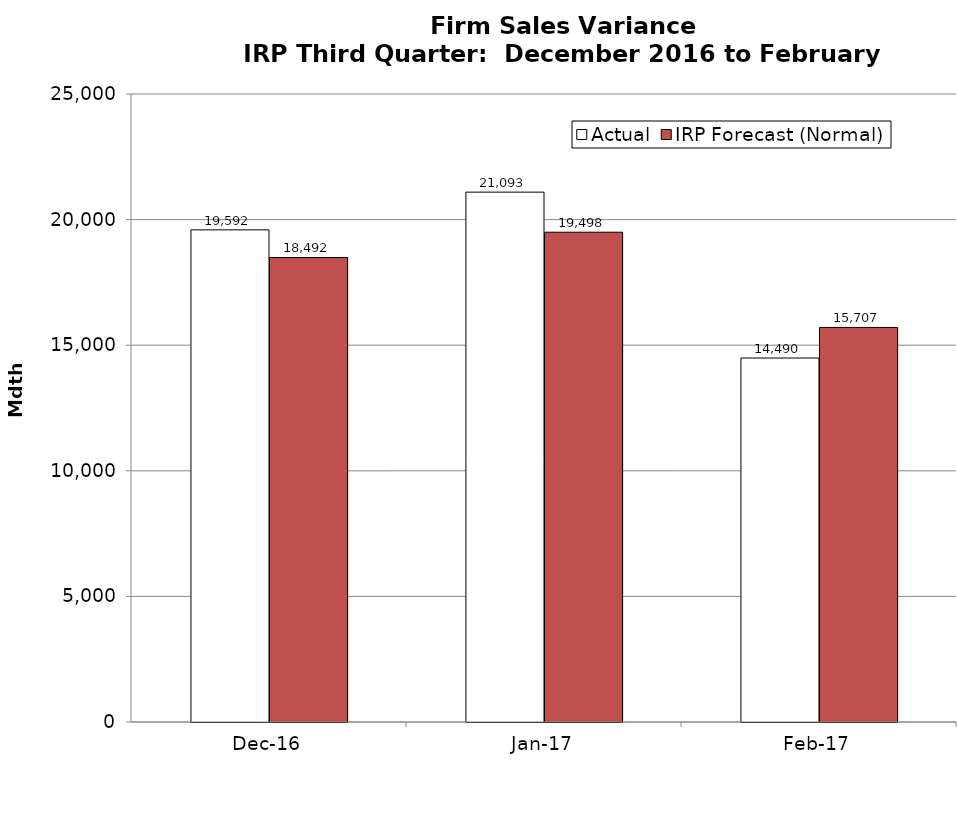
| Category | Actual | IRP Forecast (Normal) |
|---|---|---|
| 2016-12-01 | 19592.128 | 18491.824 |
| 2017-01-01 | 21093.477 | 19498.209 |
| 2017-02-01 | 14489.743 | 15706.513 |